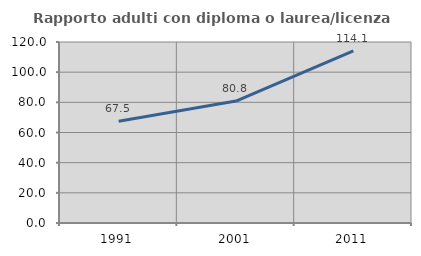
| Category | Rapporto adulti con diploma o laurea/licenza media  |
|---|---|
| 1991.0 | 67.49 |
| 2001.0 | 80.823 |
| 2011.0 | 114.067 |